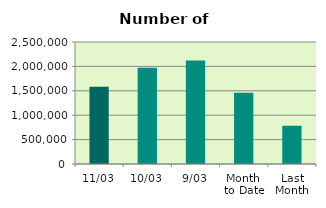
| Category | Series 0 |
|---|---|
| 11/03 | 1584386 |
| 10/03 | 1973974 |
| 9/03 | 2119622 |
| Month 
to Date | 1458436 |
| Last
Month | 783511.9 |